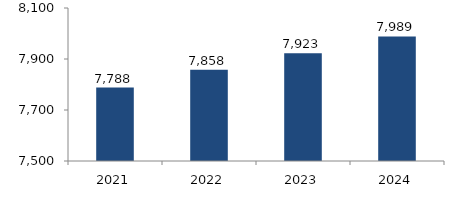
| Category | Bogotá |
|---|---|
| 2021.0 | 7787.77 |
| 2022.0 | 7857.974 |
| 2023.0 | 7922.687 |
| 2024.0 | 7988.507 |